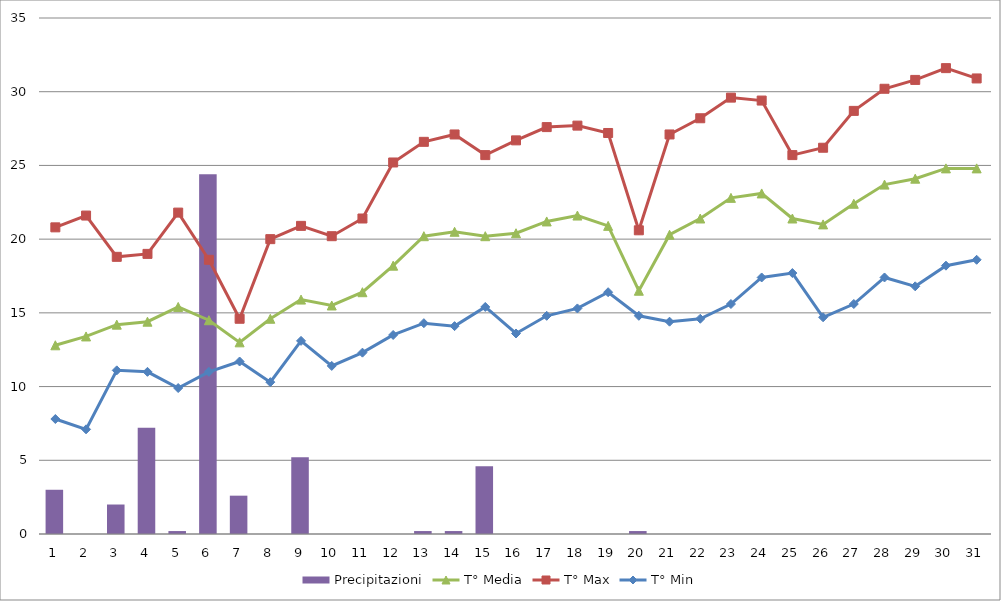
| Category | Precipitazioni |
|---|---|
| 0 | 3 |
| 1 | 0 |
| 2 | 2 |
| 3 | 7.2 |
| 4 | 0.2 |
| 5 | 24.4 |
| 6 | 2.6 |
| 7 | 0 |
| 8 | 5.2 |
| 9 | 0 |
| 10 | 0 |
| 11 | 0 |
| 12 | 0.2 |
| 13 | 0.2 |
| 14 | 4.6 |
| 15 | 0 |
| 16 | 0 |
| 17 | 0 |
| 18 | 0 |
| 19 | 0.2 |
| 20 | 0 |
| 21 | 0 |
| 22 | 0 |
| 23 | 0 |
| 24 | 0 |
| 25 | 0 |
| 26 | 0 |
| 27 | 0 |
| 28 | 0 |
| 29 | 0 |
| 30 | 0 |